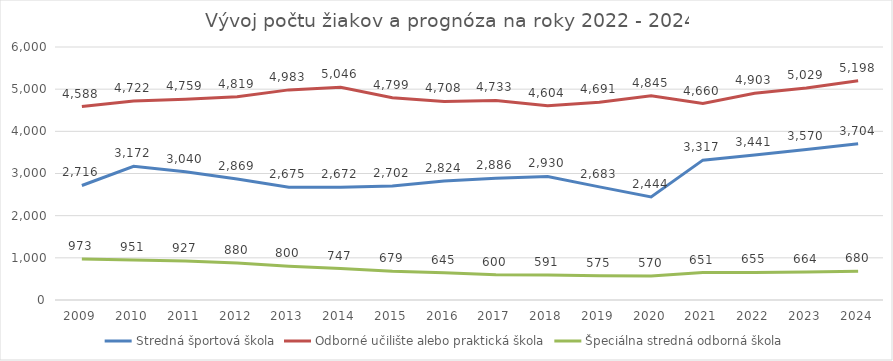
| Category | Stredná športová škola | Odborné učilište alebo praktická škola | Špeciálna stredná odborná škola |
|---|---|---|---|
| 2009.0 | 2716 | 4588 | 973 |
| 2010.0 | 3172 | 4722 | 951 |
| 2011.0 | 3040 | 4759 | 927 |
| 2012.0 | 2869 | 4819 | 880 |
| 2013.0 | 2675 | 4983 | 800 |
| 2014.0 | 2672 | 5046 | 747 |
| 2015.0 | 2702 | 4799 | 679 |
| 2016.0 | 2824 | 4708 | 645 |
| 2017.0 | 2886 | 4733 | 600 |
| 2018.0 | 2930 | 4604 | 591 |
| 2019.0 | 2683 | 4691 | 575 |
| 2020.0 | 2444 | 4845 | 570 |
| 2021.0 | 3317 | 4660 | 651 |
| 2022.0 | 3441 | 4903 | 655 |
| 2023.0 | 3570 | 5029 | 664 |
| 2024.0 | 3704 | 5198 | 680 |